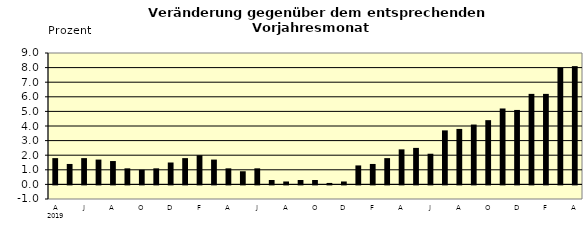
| Category | Series 0 |
|---|---|
| 0 | 1.8 |
| 1 | 1.4 |
| 2 | 1.8 |
| 3 | 1.7 |
| 4 | 1.6 |
| 5 | 1.1 |
| 6 | 1 |
| 7 | 1.1 |
| 8 | 1.5 |
| 9 | 1.8 |
| 10 | 2 |
| 11 | 1.7 |
| 12 | 1.1 |
| 13 | 0.9 |
| 14 | 1.1 |
| 15 | 0.3 |
| 16 | 0.2 |
| 17 | 0.3 |
| 18 | 0.3 |
| 19 | 0.1 |
| 20 | 0.2 |
| 21 | 1.3 |
| 22 | 1.4 |
| 23 | 1.8 |
| 24 | 2.4 |
| 25 | 2.5 |
| 26 | 2.1 |
| 27 | 3.7 |
| 28 | 3.8 |
| 29 | 4.1 |
| 30 | 4.4 |
| 31 | 5.2 |
| 32 | 5.1 |
| 33 | 6.2 |
| 34 | 6.2 |
| 35 | 8 |
| 36 | 8.1 |